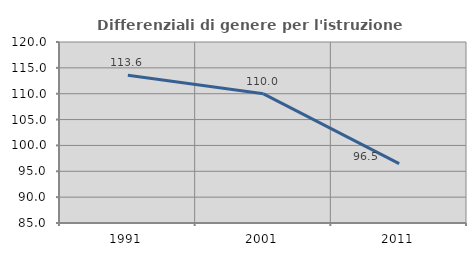
| Category | Differenziali di genere per l'istruzione superiore |
|---|---|
| 1991.0 | 113.575 |
| 2001.0 | 109.976 |
| 2011.0 | 96.48 |